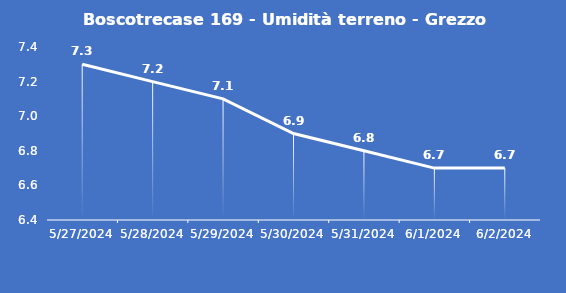
| Category | Boscotrecase 169 - Umidità terreno - Grezzo (%VWC) |
|---|---|
| 5/27/24 | 7.3 |
| 5/28/24 | 7.2 |
| 5/29/24 | 7.1 |
| 5/30/24 | 6.9 |
| 5/31/24 | 6.8 |
| 6/1/24 | 6.7 |
| 6/2/24 | 6.7 |